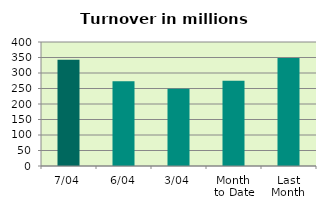
| Category | Series 0 |
|---|---|
| 7/04 | 342.693 |
| 6/04 | 273.425 |
| 3/04 | 249.557 |
| Month 
to Date | 274.673 |
| Last
Month | 348.012 |